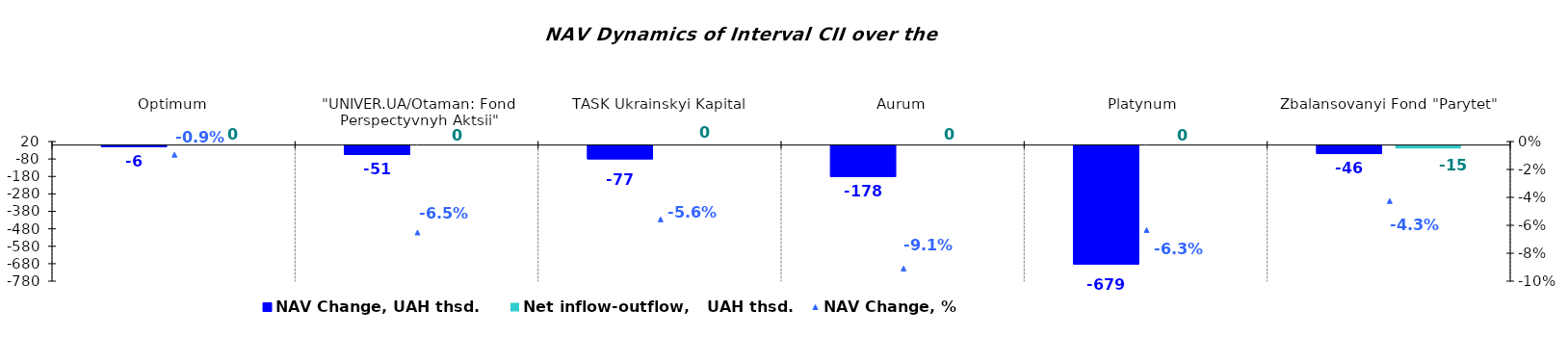
| Category | NAV Change, UAH thsd. | Net inflow-outflow,   UAH thsd. |
|---|---|---|
| Optimum | -6.005 | 0 |
| "UNIVER.UA/Otaman: Fond Perspectyvnyh Aktsii" | -51.16 | 0 |
| TASK Ukrainskyi Kapital | -76.689 | 0 |
| Аurum | -177.738 | 0 |
| Platynum  | -678.799 | 0 |
| Zbalansovanyi Fond "Parytet" | -46.463 | -15.168 |